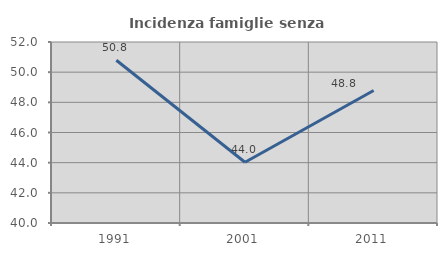
| Category | Incidenza famiglie senza nuclei |
|---|---|
| 1991.0 | 50.79 |
| 2001.0 | 44.027 |
| 2011.0 | 48.786 |